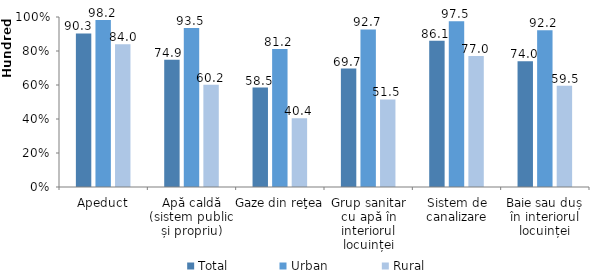
| Category | Total | Urban  | Rural |
|---|---|---|---|
| Apeduct | 90.3 | 98.2 | 84 |
| Apă caldă (sistem public și propriu) | 74.9 | 93.5 | 60.2 |
| Gaze din reţea | 58.5 | 81.2 | 40.4 |
| Grup sanitar cu apă în interiorul locuinței | 69.7 | 92.7 | 51.5 |
| Sistem de canalizare | 86.1 | 97.5 | 77 |
| Baie sau duș în interiorul locuinței | 74 | 92.2 | 59.5 |